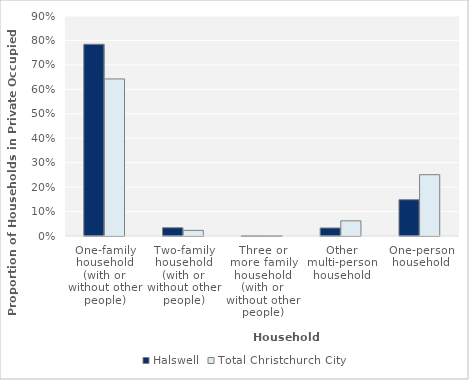
| Category | Halswell | Total Christchurch City |
|---|---|---|
| One-family household (with or without other people) | 0.784 |  |
| Two-family household (with or without other people) | 0.034 |  |
| Three or more family household (with or without other people) | 0.001 |  |
| Other multi-person household | 0.033 |  |
| One-person household | 0.149 |  |